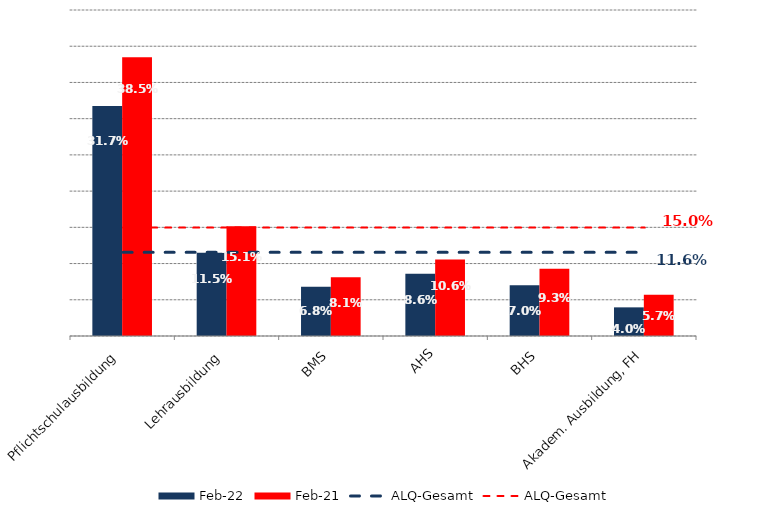
| Category | Feb 22 | Feb 21 |
|---|---|---|
| Pflichtschulausbildung | 0.317 | 0.385 |
| Lehrausbildung | 0.115 | 0.151 |
| BMS | 0.068 | 0.081 |
| AHS | 0.086 | 0.106 |
| BHS | 0.07 | 0.093 |
| Akadem. Ausbildung, FH | 0.04 | 0.057 |